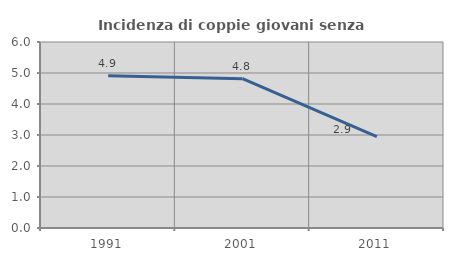
| Category | Incidenza di coppie giovani senza figli |
|---|---|
| 1991.0 | 4.912 |
| 2001.0 | 4.818 |
| 2011.0 | 2.945 |